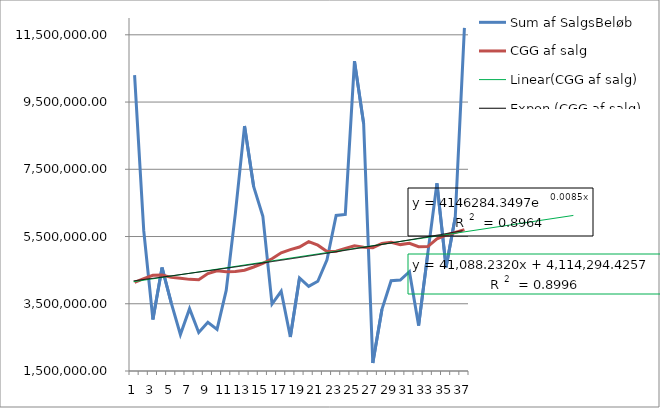
| Category | Sum af SalgsBeløb | CGG af salg |
|---|---|---|
| 0 | 10299500 | 4136722.917 |
| 1 | 5674600 | 4249381.25 |
| 2 | 3031200 | 4347075 |
| 3 | 4578500 | 4356437.5 |
| 4 | 3524300 | 4284393.75 |
| 5 | 2585450 | 4259716.667 |
| 6 | 3354400 | 4225693.75 |
| 7 | 2646150 | 4217112.5 |
| 8 | 2947350 | 4399695.833 |
| 9 | 2738550 | 4482472.917 |
| 10 | 3897600 | 4451643.75 |
| 11 | 6188000 | 4463012.5 |
| 12 | 8784950 | 4498027.083 |
| 13 | 6983200 | 4593187.5 |
| 14 | 6104600 | 4701210.417 |
| 15 | 3491750 | 4838237.5 |
| 16 | 3871150 | 5017168.75 |
| 17 | 2511450 | 5108756.25 |
| 18 | 4268750 | 5187952.083 |
| 19 | 4015650 | 5346654.167 |
| 20 | 4170400 | 5242856.25 |
| 21 | 4804150 | 5054258.333 |
| 22 | 6126350 | 5060791.667 |
| 23 | 6157350 | 5144527.083 |
| 24 | 10716300 | 5222833.333 |
| 25 | 8860700 | 5181933.333 |
| 26 | 1735950 | 5167510.417 |
| 27 | 3334050 | 5296633.333 |
| 28 | 4185650 | 5327377.083 |
| 29 | 4206600 | 5259654.167 |
| 30 | 4452950 | 5297347.917 |
| 31 | 2849850 | 5198608.333 |
| 32 | 4990050 | 5201068.75 |
| 33 | 7083450 | 5431497.917 |
| 34 | 4584900 | 5539895.833 |
| 35 | 6073450 | 5618414.583 |
| 36 | 11704850 | 5704160.417 |